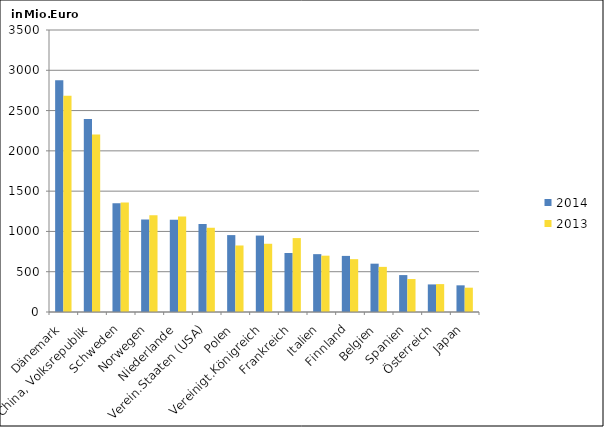
| Category | 2014 | 2013 |
|---|---|---|
| Dänemark | 2875.355 | 2683.755 |
| China, Volksrepublik | 2393.847 | 2203.286 |
| Schweden | 1350.044 | 1358.22 |
| Norwegen | 1147.857 | 1200.149 |
| Niederlande | 1146.474 | 1183.835 |
| Verein.Staaten (USA) | 1092.997 | 1045.517 |
| Polen | 954.428 | 825.571 |
| Vereinigt.Königreich | 948.555 | 846.837 |
| Frankreich | 732.447 | 917.425 |
| Italien | 718.034 | 699.007 |
| Finnland | 696.206 | 655.728 |
| Belgien | 599.783 | 560.06 |
| Spanien | 458.199 | 409.025 |
| Österreich | 342.296 | 346.237 |
| Japan | 330.93 | 301.741 |